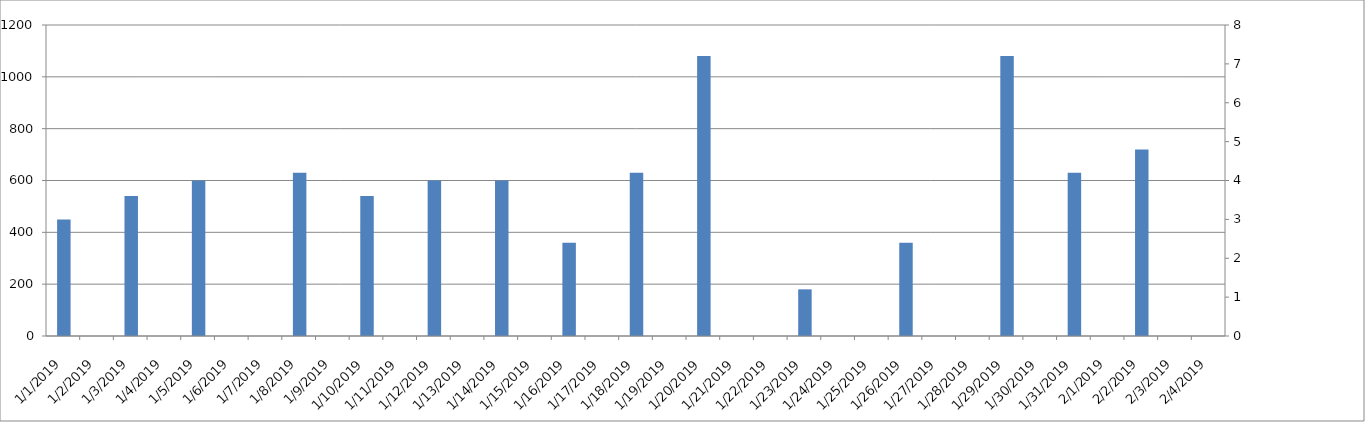
| Category | Series 0 |
|---|---|
| 1/1/19 | 450 |
| 1/2/19 | 0 |
| 1/3/19 | 540 |
| 1/4/19 | 0 |
| 1/5/19 | 600 |
| 1/6/19 | 0 |
| 1/7/19 | 0 |
| 1/8/19 | 630 |
| 1/9/19 | 0 |
| 1/10/19 | 540 |
| 1/11/19 | 0 |
| 1/12/19 | 600 |
| 1/13/19 | 0 |
| 1/14/19 | 600 |
| 1/15/19 | 0 |
| 1/16/19 | 360 |
| 1/17/19 | 0 |
| 1/18/19 | 630 |
| 1/19/19 | 0 |
| 1/20/19 | 1080 |
| 1/21/19 | 0 |
| 1/22/19 | 0 |
| 1/23/19 | 180 |
| 1/24/19 | 0 |
| 1/25/19 | 0 |
| 1/26/19 | 360 |
| 1/27/19 | 0 |
| 1/28/19 | 0 |
| 1/29/19 | 1080 |
| 1/30/19 | 0 |
| 1/31/19 | 630 |
| 2/1/19 | 0 |
| 2/2/19 | 720 |
| 2/3/19 | 0 |
| 2/4/19 | 0 |